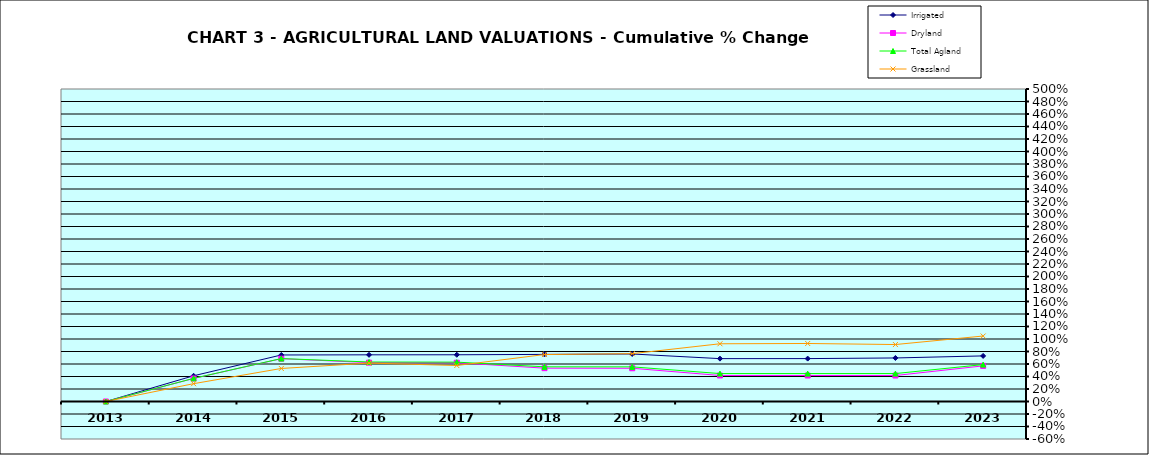
| Category | Irrigated | Dryland | Total Agland | Grassland |
|---|---|---|---|---|
| 2013.0 | 0 | 0 | 0 | 0 |
| 2014.0 | 0.412 | 0.368 | 0.37 | 0.285 |
| 2015.0 | 0.744 | 0.685 | 0.687 | 0.529 |
| 2016.0 | 0.747 | 0.622 | 0.632 | 0.614 |
| 2017.0 | 0.748 | 0.62 | 0.63 | 0.576 |
| 2018.0 | 0.754 | 0.533 | 0.555 | 0.751 |
| 2019.0 | 0.76 | 0.532 | 0.554 | 0.765 |
| 2020.0 | 0.686 | 0.416 | 0.447 | 0.924 |
| 2021.0 | 0.686 | 0.416 | 0.447 | 0.928 |
| 2022.0 | 0.697 | 0.416 | 0.447 | 0.911 |
| 2023.0 | 0.73 | 0.57 | 0.591 | 1.048 |